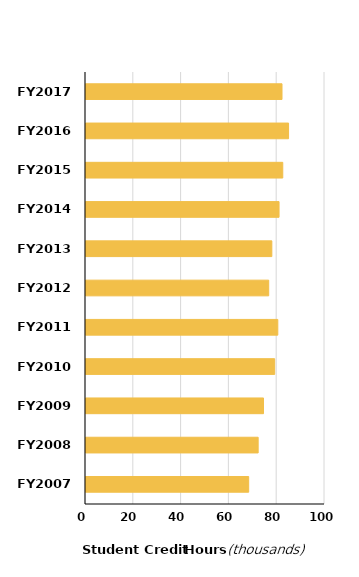
| Category | Total |
|---|---|
| FY2007 | 68483 |
| FY2008 | 72451 |
| FY2009 | 74687 |
| FY2010 | 79370 |
| FY2011 | 80669 |
| FY2012 | 76869 |
| FY2013 | 78173 |
| FY2014 | 81196 |
| FY2015 | 82751.22 |
| FY2016 | 85173.39 |
| FY2017 | 82432.163 |